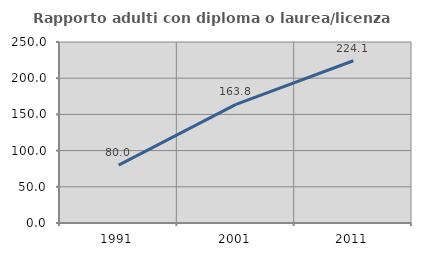
| Category | Rapporto adulti con diploma o laurea/licenza media  |
|---|---|
| 1991.0 | 80 |
| 2001.0 | 163.819 |
| 2011.0 | 224.121 |